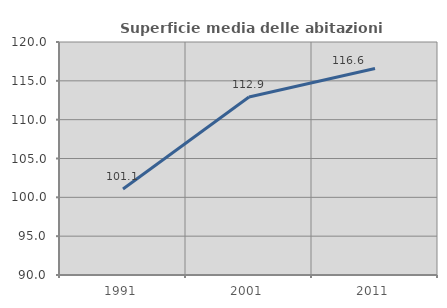
| Category | Superficie media delle abitazioni occupate |
|---|---|
| 1991.0 | 101.063 |
| 2001.0 | 112.916 |
| 2011.0 | 116.593 |